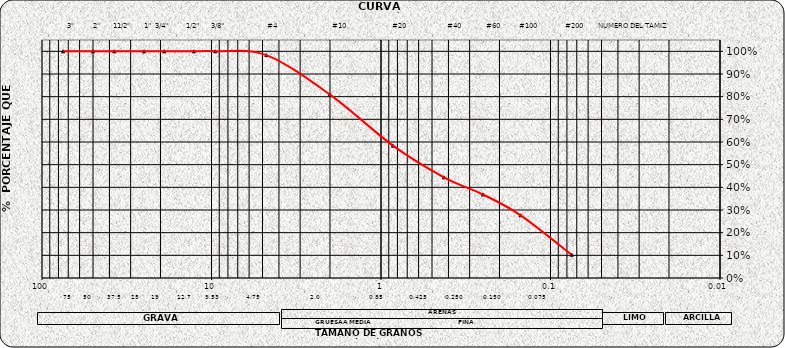
| Category | Series 0 |
|---|---|
| 75.0 | 1 |
| 50.0 | 1 |
| 37.5 | 1 |
| 25.0 | 1 |
| 19.0 | 1 |
| 12.7 | 1 |
| 9.5 | 1 |
| 4.75 | 0.983 |
| 2.0 | 0.809 |
| 0.85 | 0.584 |
| 0.425 | 0.444 |
| 0.25 | 0.368 |
| 0.15 | 0.277 |
| 0.075 | 0.102 |
| nan | 0 |